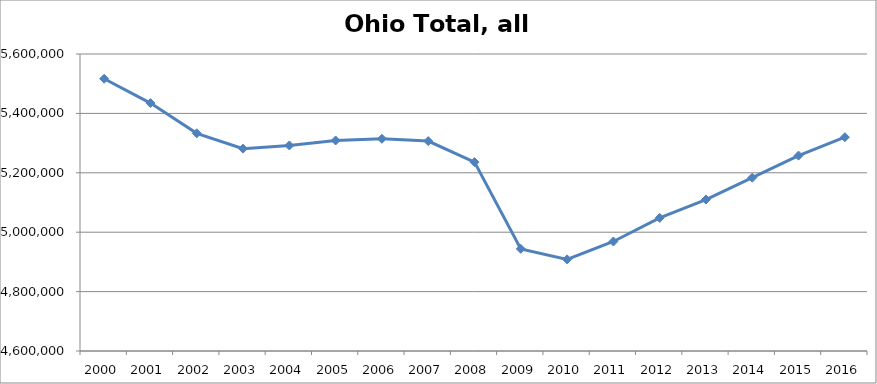
| Category | Ohio |
|---|---|
| 2000 | 5516683 |
| 2001 | 5434769 |
| 2002 | 5332891 |
| 2003 | 5281390 |
| 2004 | 5292088 |
| 2005 | 5308808 |
| 2006 | 5314572 |
| 2007 | 5306812 |
| 2008 | 5235972 |
| 2009 | 4943970 |
| 2010 | 4908571 |
| 2011 | 4968724 |
| 2012 | 5048166 |
| 2013 | 5110011 |
| 2014 | 5183462 |
| 2015 | 5257971 |
| 2016 | 5319910 |